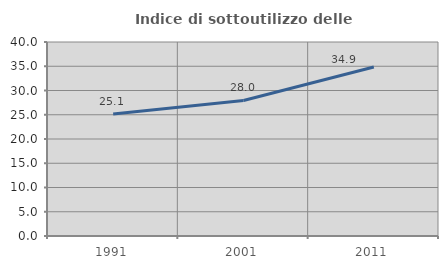
| Category | Indice di sottoutilizzo delle abitazioni  |
|---|---|
| 1991.0 | 25.143 |
| 2001.0 | 27.952 |
| 2011.0 | 34.852 |